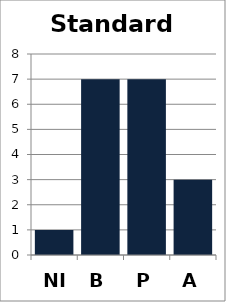
| Category | Standard 2 |
|---|---|
| NI | 1 |
| B | 7 |
| P | 7 |
| A | 3 |